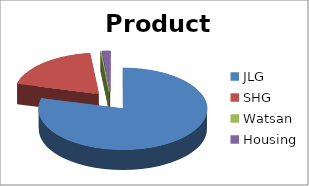
| Category | Product Loans O/s (Rs.) |
|---|---|
| JLG | 164757123 |
| SHG | 40246663 |
| Watsan | 216518 |
| Housing | 3219000 |